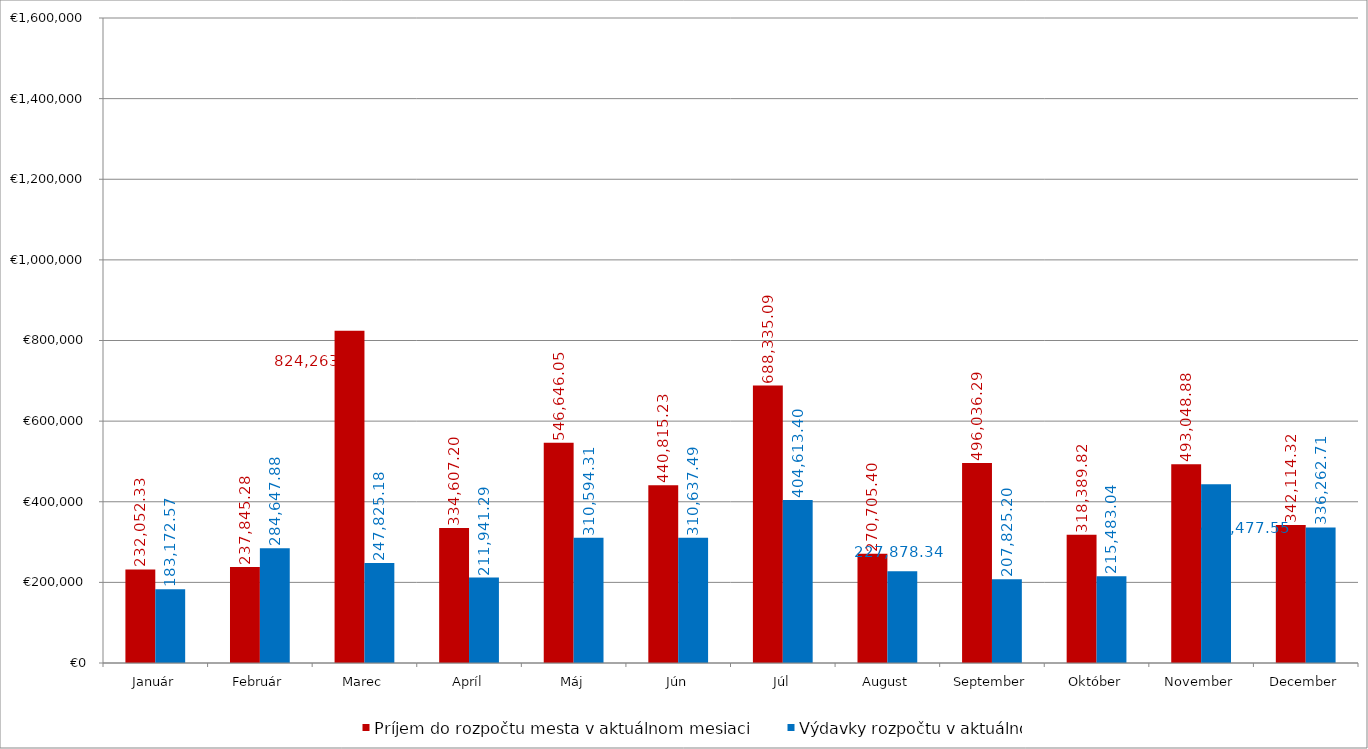
| Category | Príjem do rozpočtu mesta v aktuálnom mesiaci | Výdavky rozpočtu v aktuálnom  mesiaci |
|---|---|---|
| Január | 232052.33 | 183172.57 |
| Február | 237845.28 | 284647.88 |
| Marec | 824263.45 | 247825.18 |
| Apríl | 334607.2 | 211941.29 |
| Máj | 546646.053 | 310594.31 |
| Jún | 440815.227 | 310637.49 |
| Júl | 688335.09 | 404613.4 |
| August | 270705.4 | 227878.34 |
| September | 496036.29 | 207825.2 |
| Október | 318389.82 | 215483.04 |
| November | 493048.88 | 443477.55 |
| December | 342114.32 | 336262.71 |